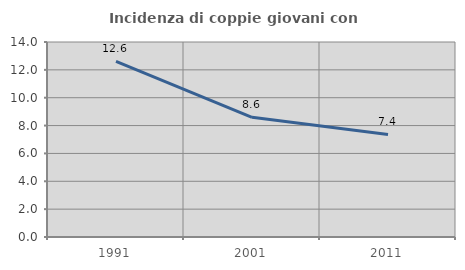
| Category | Incidenza di coppie giovani con figli |
|---|---|
| 1991.0 | 12.614 |
| 2001.0 | 8.596 |
| 2011.0 | 7.363 |